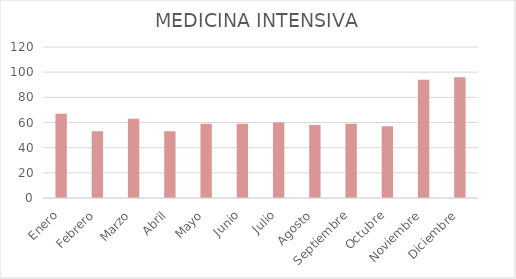
| Category | MEDICINA INTENSIVA |
|---|---|
| Enero | 67 |
| Febrero | 53 |
| Marzo | 63 |
| Abril | 53 |
| Mayo | 59 |
| Junio | 59 |
| Julio | 60 |
| Agosto | 58 |
| Septiembre | 59 |
| Octubre | 57 |
| Noviembre | 94 |
| Diciembre | 96 |